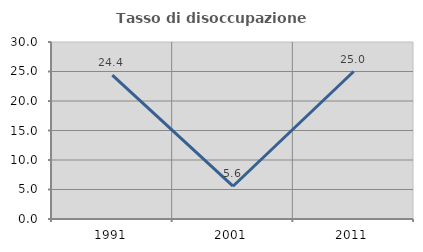
| Category | Tasso di disoccupazione giovanile  |
|---|---|
| 1991.0 | 24.39 |
| 2001.0 | 5.556 |
| 2011.0 | 25 |